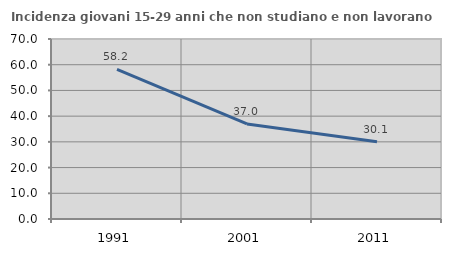
| Category | Incidenza giovani 15-29 anni che non studiano e non lavorano  |
|---|---|
| 1991.0 | 58.197 |
| 2001.0 | 36.97 |
| 2011.0 | 30.081 |